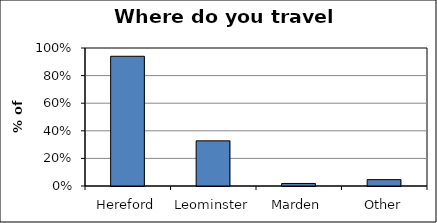
| Category | Series 0 |
|---|---|
| Hereford | 0.94 |
| Leominster | 0.327 |
| Marden | 0.018 |
| Other | 0.046 |